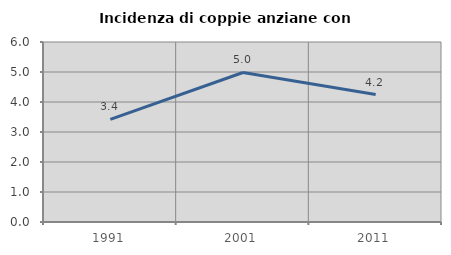
| Category | Incidenza di coppie anziane con figli |
|---|---|
| 1991.0 | 3.418 |
| 2001.0 | 4.984 |
| 2011.0 | 4.248 |